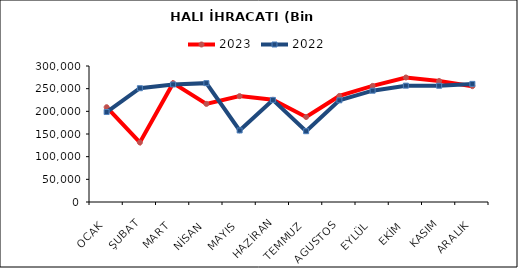
| Category | 2023 | 2022 |
|---|---|---|
| OCAK | 209099.528 | 198477.641 |
| ŞUBAT | 131395.682 | 251000.235 |
| MART | 262162.338 | 259243.728 |
| NİSAN | 216365.998 | 262164.347 |
| MAYIS | 233538.612 | 157792.492 |
| HAZİRAN | 225469.651 | 225184.988 |
| TEMMUZ | 187517.207 | 156147.208 |
| AGUSTOS | 233925.832 | 224283.589 |
| EYLÜL | 256088.302 | 245518.366 |
| EKİM | 274625.174 | 256622.59 |
| KASIM | 266904.028 | 256407.398 |
| ARALIK | 255554.614 | 260537.565 |